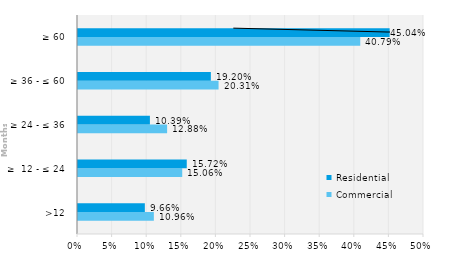
| Category | Commercial | Residential |
|---|---|---|
| >12 | 0.11 | 0.097 |
| ≥  12 - ≤ 24 | 0.151 | 0.157 |
| ≥ 24 - ≤ 36 | 0.129 | 0.104 |
| ≥ 36 - ≤ 60 | 0.203 | 0.192 |
| ≥ 60 | 0.408 | 0.45 |